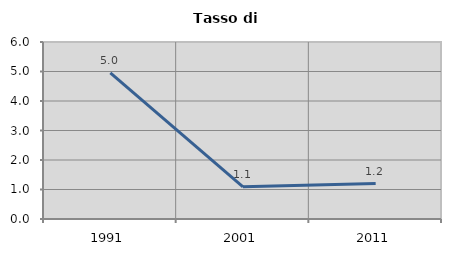
| Category | Tasso di disoccupazione   |
|---|---|
| 1991.0 | 4.955 |
| 2001.0 | 1.089 |
| 2011.0 | 1.202 |